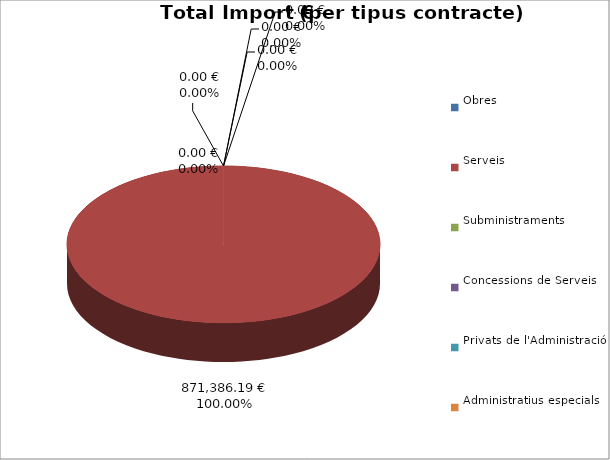
| Category | Total preu
(amb IVA) |
|---|---|
| Obres | 0 |
| Serveis | 871386.19 |
| Subministraments | 0 |
| Concessions de Serveis | 0 |
| Privats de l'Administració | 0 |
| Administratius especials | 0 |